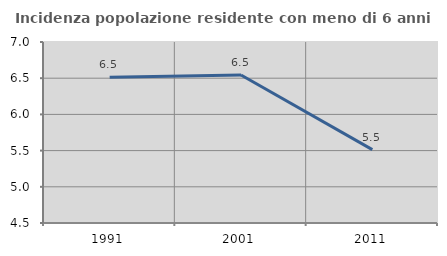
| Category | Incidenza popolazione residente con meno di 6 anni |
|---|---|
| 1991.0 | 6.513 |
| 2001.0 | 6.545 |
| 2011.0 | 5.513 |